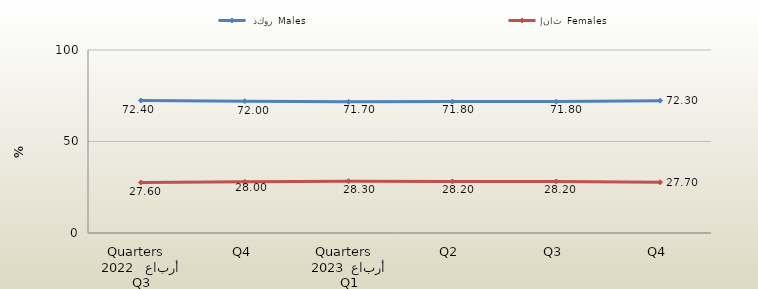
| Category |   ذكور  Males  |  إناث  Females  |
|---|---|---|
| 0 | 72.4 | 27.6 |
| 1 | 72 | 28 |
| 2 | 71.7 | 28.3 |
| 3 | 71.8 | 28.2 |
| 4 | 71.8 | 28.2 |
| 5 | 72.3 | 27.7 |